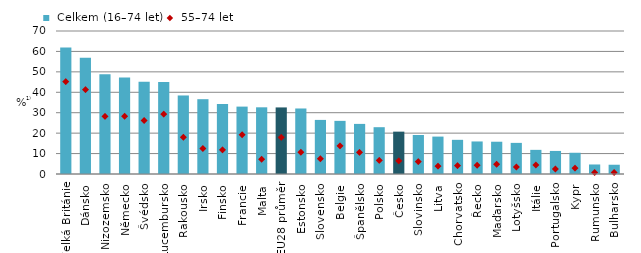
| Category |  Celkem (16–74 let) |
|---|---|
| Velká Británie | 61.893 |
| Dánsko | 56.875 |
| Nizozemsko | 48.803 |
| Německo | 47.197 |
| Švédsko | 45.178 |
| Lucembursko | 45.052 |
| Rakousko | 38.439 |
| Irsko | 36.616 |
| Finsko | 34.306 |
| Francie | 32.991 |
| Malta | 32.647 |
| EU28 průměr | 32.59 |
| Estonsko | 32.072 |
| Slovensko | 26.476 |
| Belgie | 26.009 |
| Španělsko | 24.525 |
| Polsko | 22.912 |
| Česko | 20.734 |
| Slovinsko | 19.102 |
| Litva | 18.313 |
| Chorvatsko | 16.726 |
| Řecko | 15.926 |
| Maďarsko | 15.797 |
| Lotyšsko | 15.233 |
| Itálie | 11.819 |
| Portugalsko | 11.287 |
| Kypr | 10.397 |
| Rumunsko | 4.662 |
| Bulharsko | 4.536 |